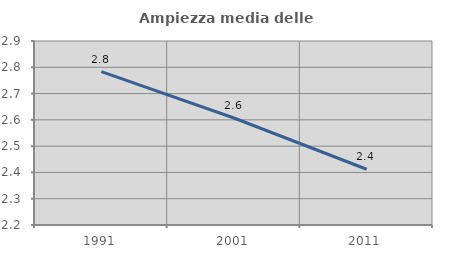
| Category | Ampiezza media delle famiglie |
|---|---|
| 1991.0 | 2.783 |
| 2001.0 | 2.607 |
| 2011.0 | 2.412 |